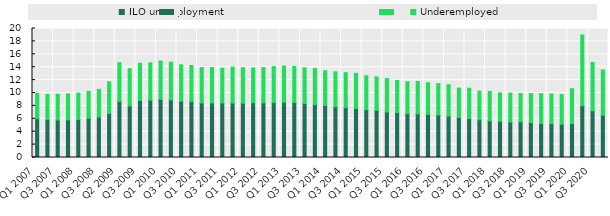
| Category | ILO unemployment | Underemployed |
|---|---|---|
| Q1 2007 | 6.015 | 3.922 |
| Q2 2007 | 5.876 | 3.896 |
| Q3 2007 | 5.824 | 3.978 |
| Q4 2007 | 5.845 | 4.004 |
| Q1 2008 | 5.88 | 4.105 |
| Q2 2008 | 6.079 | 4.173 |
| Q3 2008 | 6.267 | 4.294 |
| Q4 2008 | 6.833 | 4.906 |
| Q2 2009 | 8.704 | 5.991 |
| Q1 2009 | 7.984 | 5.786 |
| Q3 2009 | 8.841 | 5.779 |
| Q4 2009 | 8.896 | 5.779 |
| Q1 2010 | 9.012 | 5.937 |
| Q2 2010 | 8.938 | 5.838 |
| Q3 2010 | 8.721 | 5.646 |
| Q4 2010 | 8.653 | 5.612 |
| Q1 2011 | 8.445 | 5.502 |
| Q2 2011 | 8.456 | 5.491 |
| Q3 2011 | 8.444 | 5.404 |
| Q4 2011 | 8.425 | 5.6 |
| Q1 2012 | 8.427 | 5.496 |
| Q2 2012 | 8.5 | 5.382 |
| Q3 2012 | 8.464 | 5.479 |
| Q4 2012 | 8.515 | 5.586 |
| Q1 2013 | 8.571 | 5.598 |
| Q2 2013 | 8.533 | 5.581 |
| Q3 2013 | 8.368 | 5.527 |
| Q4 2013 | 8.203 | 5.598 |
| Q1 2014 | 8.065 | 5.377 |
| Q2 2014 | 7.848 | 5.431 |
| Q3 2014 | 7.737 | 5.417 |
| Q4 2014 | 7.606 | 5.447 |
| Q1 2015 | 7.407 | 5.278 |
| Q2 2015 | 7.315 | 5.183 |
| Q3 2015 | 7.057 | 5.176 |
| Q4 2015 | 6.97 | 4.978 |
| Q1 2016 | 6.812 | 4.929 |
| Q2 2016 | 6.768 | 5.027 |
| Q3 2016 | 6.697 | 4.889 |
| Q4 2016 | 6.598 | 4.86 |
| Q1 2017 | 6.41 | 4.875 |
| Q2 2017 | 6.205 | 4.555 |
| Q3 2017 | 6.04 | 4.694 |
| Q4 2017 | 5.847 | 4.436 |
| Q1 2018 | 5.692 | 4.547 |
| Q2 2018 | 5.624 | 4.402 |
| Q3 2018 | 5.505 | 4.49 |
| Q4 2018 | 5.534 | 4.405 |
| Q1 2019 | 5.42 | 4.499 |
| Q2 2019 | 5.271 | 4.624 |
| Q3 2019 | 5.256 | 4.589 |
| Q4 2019 | 5.162 | 4.587 |
| Q1 2020 | 5.264 | 5.394 |
| Q2 2020 | 8.034 | 10.953 |
| Q3 2020 | 7.231 | 7.509 |
| Q4 2020 | 6.571 | 6.996 |